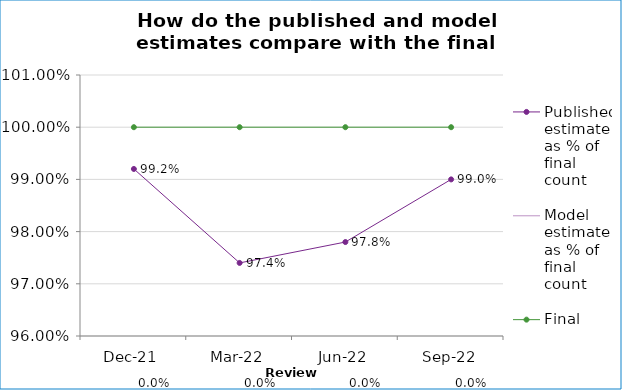
| Category | Published estimate as % of final count | Model estimate as % of final count   | Final count (100%) |
|---|---|---|---|
| 2021-12-01 | 0.992 |  | 1 |
| 2022-03-01 | 0.974 |  | 1 |
| 2022-06-01 | 0.978 |  | 1 |
| 2022-09-01 | 0.99 |  | 1 |